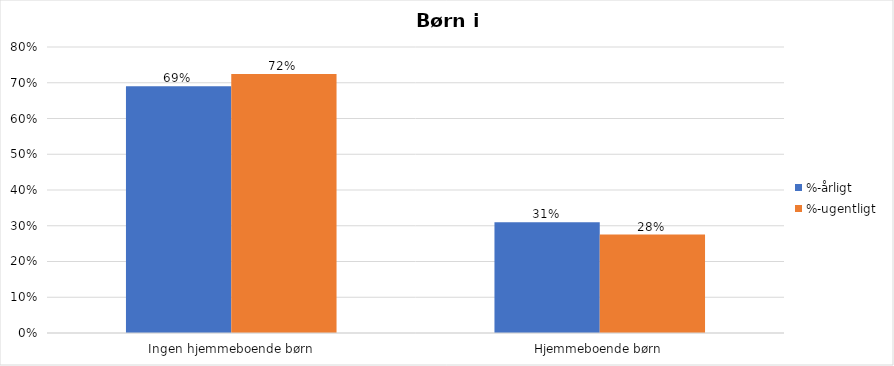
| Category | %-årligt | %-ugentligt |
|---|---|---|
| Ingen hjemmeboende børn | 0.69 | 0.725 |
| Hjemmeboende børn | 0.31 | 0.275 |